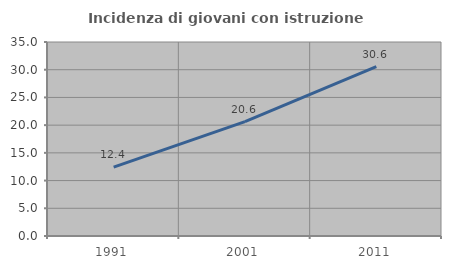
| Category | Incidenza di giovani con istruzione universitaria |
|---|---|
| 1991.0 | 12.44 |
| 2001.0 | 20.62 |
| 2011.0 | 30.566 |